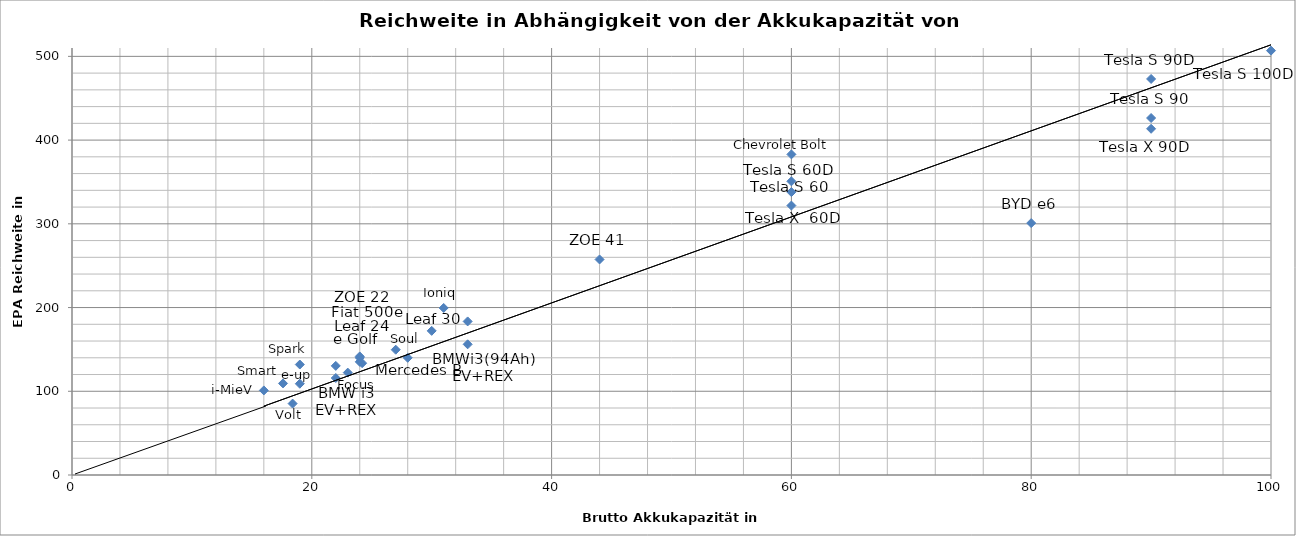
| Category | Akkukapazität kWh Brutto |
|---|---|
| 22.0 | 130.329 |
| 60.0 | 382.942 |
| 19.0 | 131.938 |
| 33.0 | 183.426 |
| 24.2 | 133.547 |
| 24.0 | 139.983 |
| 24.0 | 135.156 |
| 16.0 | 101 |
| 30.0 | 172.163 |
| 17.6 | 109.412 |
| 27.0 | 149.637 |
| 23.0 | 122.284 |
| 60.0 | 350.762 |
| 90.0 | 473.046 |
| 60.0 | 337.89 |
| 60.0 | 321.8 |
| 90.0 | 426.385 |
| 90.0 | 413.513 |
| 28.0 | 139.983 |
| 80.0 | 300.883 |
| 24.0 | 141.592 |
| 44.0 | 257.44 |
| 19.0 | 109 |
| 31.0 | 199.516 |
| 100.0 | 506.835 |
| 22.0 | 115.848 |
| 33.0 | 156.073 |
| 18.4 | 85.277 |